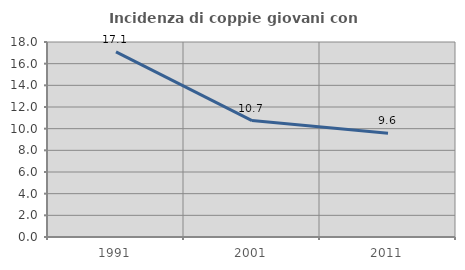
| Category | Incidenza di coppie giovani con figli |
|---|---|
| 1991.0 | 17.085 |
| 2001.0 | 10.745 |
| 2011.0 | 9.572 |